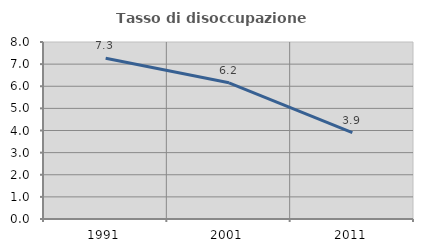
| Category | Tasso di disoccupazione giovanile  |
|---|---|
| 1991.0 | 7.263 |
| 2001.0 | 6.154 |
| 2011.0 | 3.902 |